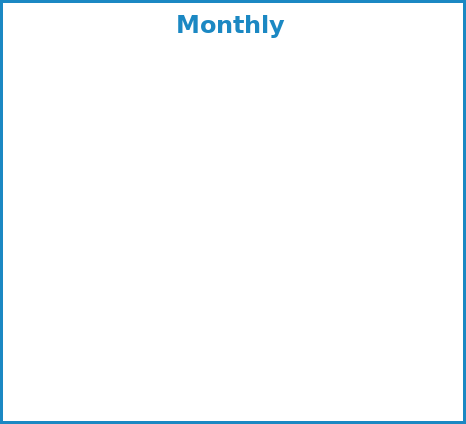
| Category | Series 1 |
|---|---|
| Utilities: | 0 |
| Living: | 0 |
| Vehicles: | 0 |
| Home: | 0 |
| Insurance: | 0 |
| Short Term Debt: | 0 |
| Saving: | 0 |
| Other: | 0 |
| Deficit | 0 |